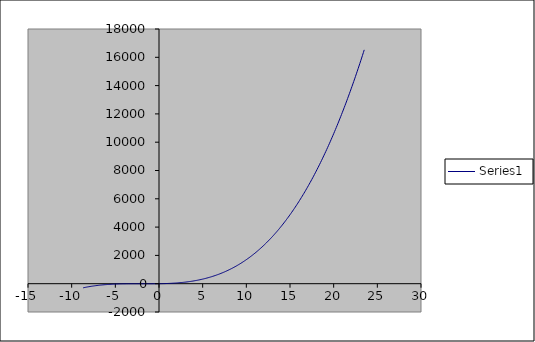
| Category | Series 0 |
|---|---|
| -8.700000000000005 | -292.363 |
| -8.600000000000005 | -279.296 |
| -8.500000000000005 | -266.625 |
| -8.400000000000006 | -254.344 |
| -8.300000000000006 | -242.447 |
| -8.200000000000006 | -230.928 |
| -8.100000000000007 | -219.781 |
| -8.000000000000007 | -209 |
| -7.9000000000000075 | -198.579 |
| -7.800000000000008 | -188.512 |
| -7.700000000000008 | -178.793 |
| -7.6000000000000085 | -169.416 |
| -7.500000000000009 | -160.375 |
| -7.400000000000009 | -151.664 |
| -7.30000000000001 | -143.277 |
| -7.20000000000001 | -135.208 |
| -7.10000000000001 | -127.451 |
| -7.000000000000011 | -120 |
| -6.900000000000011 | -112.849 |
| -6.800000000000011 | -105.992 |
| -6.700000000000012 | -99.423 |
| -6.600000000000012 | -93.136 |
| -6.500000000000012 | -87.125 |
| -6.400000000000013 | -81.384 |
| -6.300000000000013 | -75.907 |
| -6.2000000000000135 | -70.688 |
| -6.100000000000014 | -65.721 |
| -6.000000000000014 | -61 |
| -5.900000000000015 | -56.519 |
| -5.800000000000015 | -52.272 |
| -5.700000000000015 | -48.253 |
| -5.600000000000016 | -44.456 |
| -5.500000000000016 | -40.875 |
| -5.400000000000016 | -37.504 |
| -5.300000000000017 | -34.337 |
| -5.200000000000017 | -31.368 |
| -5.100000000000017 | -28.591 |
| -5.000000000000018 | -26 |
| -4.900000000000018 | -23.589 |
| -4.8000000000000185 | -21.352 |
| -4.700000000000019 | -19.283 |
| -4.600000000000019 | -17.376 |
| -4.5000000000000195 | -15.625 |
| -4.40000000000002 | -14.024 |
| -4.30000000000002 | -12.567 |
| -4.200000000000021 | -11.248 |
| -4.100000000000021 | -10.061 |
| -4.000000000000021 | -9 |
| -3.9000000000000212 | -8.059 |
| -3.800000000000021 | -7.232 |
| -3.700000000000021 | -6.513 |
| -3.600000000000021 | -5.896 |
| -3.500000000000021 | -5.375 |
| -3.400000000000021 | -4.944 |
| -3.3000000000000207 | -4.597 |
| -3.2000000000000206 | -4.328 |
| -3.1000000000000205 | -4.131 |
| -3.0000000000000204 | -4 |
| -2.9000000000000203 | -3.929 |
| -2.8000000000000203 | -3.912 |
| -2.70000000000002 | -3.943 |
| -2.60000000000002 | -4.016 |
| -2.50000000000002 | -4.125 |
| -2.40000000000002 | -4.264 |
| -2.30000000000002 | -4.427 |
| -2.2000000000000197 | -4.608 |
| -2.1000000000000196 | -4.801 |
| -2.0000000000000195 | -5 |
| -1.9000000000000195 | -5.199 |
| -1.8000000000000194 | -5.392 |
| -1.7000000000000193 | -5.573 |
| -1.6000000000000192 | -5.736 |
| -1.500000000000019 | -5.875 |
| -1.400000000000019 | -5.984 |
| -1.300000000000019 | -6.057 |
| -1.2000000000000188 | -6.088 |
| -1.1000000000000187 | -6.071 |
| -1.0000000000000187 | -6 |
| -0.9000000000000187 | -5.869 |
| -0.8000000000000187 | -5.672 |
| -0.7000000000000187 | -5.403 |
| -0.6000000000000187 | -5.056 |
| -0.5000000000000188 | -4.625 |
| -0.4000000000000188 | -4.104 |
| -0.3000000000000188 | -3.487 |
| -0.2000000000000188 | -2.768 |
| -0.1000000000000188 | -1.941 |
| -1.8790524691780774e-14 | -1 |
| 0.09999999999998122 | 0.061 |
| 0.19999999999998122 | 1.248 |
| 0.2999999999999812 | 2.567 |
| 0.39999999999998126 | 4.024 |
| 0.49999999999998124 | 5.625 |
| 0.5999999999999812 | 7.376 |
| 0.6999999999999812 | 9.283 |
| 0.7999999999999812 | 11.352 |
| 0.8999999999999811 | 13.589 |
| 0.9999999999999811 | 16 |
| 1.0999999999999812 | 18.591 |
| 1.1999999999999813 | 21.368 |
| 1.2999999999999814 | 24.337 |
| 1.3999999999999815 | 27.504 |
| 1.4999999999999816 | 30.875 |
| 1.5999999999999817 | 34.456 |
| 1.6999999999999817 | 38.253 |
| 1.7999999999999818 | 42.272 |
| 1.899999999999982 | 46.519 |
| 1.999999999999982 | 51 |
| 2.099999999999982 | 55.721 |
| 2.199999999999982 | 60.688 |
| 2.299999999999982 | 65.907 |
| 2.399999999999982 | 71.384 |
| 2.4999999999999822 | 77.125 |
| 2.5999999999999823 | 83.136 |
| 2.6999999999999824 | 89.423 |
| 2.7999999999999825 | 95.992 |
| 2.8999999999999826 | 102.849 |
| 2.9999999999999827 | 110 |
| 3.0999999999999828 | 117.451 |
| 3.199999999999983 | 125.208 |
| 3.299999999999983 | 133.277 |
| 3.399999999999983 | 141.664 |
| 3.499999999999983 | 150.375 |
| 3.599999999999983 | 159.416 |
| 3.6999999999999833 | 168.793 |
| 3.7999999999999834 | 178.512 |
| 3.8999999999999835 | 188.579 |
| 3.9999999999999836 | 199 |
| 4.099999999999984 | 209.781 |
| 4.199999999999983 | 220.928 |
| 4.299999999999983 | 232.447 |
| 4.399999999999983 | 244.344 |
| 4.499999999999982 | 256.625 |
| 4.599999999999982 | 269.296 |
| 4.6999999999999815 | 282.363 |
| 4.799999999999981 | 295.832 |
| 4.899999999999981 | 309.709 |
| 4.9999999999999805 | 324 |
| 5.09999999999998 | 338.711 |
| 5.19999999999998 | 353.848 |
| 5.299999999999979 | 369.417 |
| 5.399999999999979 | 385.424 |
| 5.499999999999979 | 401.875 |
| 5.599999999999978 | 418.776 |
| 5.699999999999978 | 436.133 |
| 5.799999999999978 | 453.952 |
| 5.899999999999977 | 472.239 |
| 5.999999999999977 | 491 |
| 6.0999999999999766 | 510.241 |
| 6.199999999999976 | 529.968 |
| 6.299999999999976 | 550.187 |
| 6.3999999999999755 | 570.904 |
| 6.499999999999975 | 592.125 |
| 6.599999999999975 | 613.856 |
| 6.699999999999974 | 636.103 |
| 6.799999999999974 | 658.872 |
| 6.899999999999974 | 682.169 |
| 6.999999999999973 | 706 |
| 7.099999999999973 | 730.371 |
| 7.199999999999973 | 755.288 |
| 7.299999999999972 | 780.757 |
| 7.399999999999972 | 806.784 |
| 7.499999999999972 | 833.375 |
| 7.599999999999971 | 860.536 |
| 7.699999999999971 | 888.273 |
| 7.7999999999999705 | 916.592 |
| 7.89999999999997 | 945.499 |
| 7.99999999999997 | 975 |
| 8.09999999999997 | 1005.101 |
| 8.199999999999969 | 1035.808 |
| 8.299999999999969 | 1067.127 |
| 8.399999999999968 | 1099.064 |
| 8.499999999999968 | 1131.625 |
| 8.599999999999968 | 1164.816 |
| 8.699999999999967 | 1198.643 |
| 8.799999999999967 | 1233.112 |
| 8.899999999999967 | 1268.229 |
| 8.999999999999966 | 1304 |
| 9.099999999999966 | 1340.431 |
| 9.199999999999966 | 1377.528 |
| 9.299999999999965 | 1415.297 |
| 9.399999999999965 | 1453.744 |
| 9.499999999999964 | 1492.875 |
| 9.599999999999964 | 1532.696 |
| 9.699999999999964 | 1573.213 |
| 9.799999999999963 | 1614.432 |
| 9.899999999999963 | 1656.359 |
| 9.999999999999963 | 1699 |
| 10.099999999999962 | 1742.361 |
| 10.199999999999962 | 1786.448 |
| 10.299999999999962 | 1831.267 |
| 10.399999999999961 | 1876.824 |
| 10.499999999999961 | 1923.125 |
| 10.59999999999996 | 1970.176 |
| 10.69999999999996 | 2017.983 |
| 10.79999999999996 | 2066.552 |
| 10.89999999999996 | 2115.889 |
| 10.99999999999996 | 2166 |
| 11.099999999999959 | 2216.891 |
| 11.199999999999958 | 2268.568 |
| 11.299999999999958 | 2321.037 |
| 11.399999999999958 | 2374.304 |
| 11.499999999999957 | 2428.375 |
| 11.599999999999957 | 2483.256 |
| 11.699999999999957 | 2538.953 |
| 11.799999999999956 | 2595.472 |
| 11.899999999999956 | 2652.819 |
| 11.999999999999956 | 2711 |
| 12.099999999999955 | 2770.021 |
| 12.199999999999955 | 2829.888 |
| 12.299999999999955 | 2890.607 |
| 12.399999999999954 | 2952.184 |
| 12.499999999999954 | 3014.625 |
| 12.599999999999953 | 3077.936 |
| 12.699999999999953 | 3142.123 |
| 12.799999999999953 | 3207.192 |
| 12.899999999999952 | 3273.149 |
| 12.999999999999952 | 3340 |
| 13.099999999999952 | 3407.751 |
| 13.199999999999951 | 3476.408 |
| 13.299999999999951 | 3545.977 |
| 13.39999999999995 | 3616.464 |
| 13.49999999999995 | 3687.875 |
| 13.59999999999995 | 3760.216 |
| 13.69999999999995 | 3833.493 |
| 13.79999999999995 | 3907.712 |
| 13.899999999999949 | 3982.879 |
| 13.999999999999948 | 4059 |
| 14.099999999999948 | 4136.081 |
| 14.199999999999948 | 4214.128 |
| 14.299999999999947 | 4293.147 |
| 14.399999999999947 | 4373.144 |
| 14.499999999999947 | 4454.125 |
| 14.599999999999946 | 4536.096 |
| 14.699999999999946 | 4619.063 |
| 14.799999999999946 | 4703.032 |
| 14.899999999999945 | 4788.009 |
| 14.999999999999945 | 4874 |
| 15.099999999999945 | 4961.011 |
| 15.199999999999944 | 5049.048 |
| 15.299999999999944 | 5138.117 |
| 15.399999999999944 | 5228.224 |
| 15.499999999999943 | 5319.375 |
| 15.599999999999943 | 5411.576 |
| 15.699999999999942 | 5504.833 |
| 15.799999999999942 | 5599.152 |
| 15.899999999999942 | 5694.539 |
| 15.999999999999941 | 5791 |
| 16.09999999999994 | 5888.541 |
| 16.199999999999942 | 5987.168 |
| 16.299999999999944 | 6086.887 |
| 16.399999999999945 | 6187.704 |
| 16.499999999999947 | 6289.625 |
| 16.599999999999948 | 6392.656 |
| 16.69999999999995 | 6496.803 |
| 16.79999999999995 | 6602.072 |
| 16.899999999999952 | 6708.469 |
| 16.999999999999954 | 6816 |
| 17.099999999999955 | 6924.671 |
| 17.199999999999957 | 7034.488 |
| 17.299999999999958 | 7145.457 |
| 17.39999999999996 | 7257.584 |
| 17.49999999999996 | 7370.875 |
| 17.599999999999962 | 7485.336 |
| 17.699999999999964 | 7600.973 |
| 17.799999999999965 | 7717.792 |
| 17.899999999999967 | 7835.799 |
| 17.999999999999968 | 7955 |
| 18.09999999999997 | 8075.401 |
| 18.19999999999997 | 8197.008 |
| 18.299999999999972 | 8319.827 |
| 18.399999999999974 | 8443.864 |
| 18.499999999999975 | 8569.125 |
| 18.599999999999977 | 8695.616 |
| 18.699999999999978 | 8823.343 |
| 18.79999999999998 | 8952.312 |
| 18.89999999999998 | 9082.529 |
| 18.999999999999982 | 9214 |
| 19.099999999999984 | 9346.731 |
| 19.199999999999985 | 9480.728 |
| 19.299999999999986 | 9615.997 |
| 19.399999999999988 | 9752.544 |
| 19.49999999999999 | 9890.375 |
| 19.59999999999999 | 10029.496 |
| 19.699999999999992 | 10169.913 |
| 19.799999999999994 | 10311.632 |
| 19.899999999999995 | 10454.659 |
| 19.999999999999996 | 10599 |
| 20.099999999999998 | 10744.661 |
| 20.2 | 10891.648 |
| 20.3 | 11039.967 |
| 20.400000000000002 | 11189.624 |
| 20.500000000000004 | 11340.625 |
| 20.600000000000005 | 11492.976 |
| 20.700000000000006 | 11646.683 |
| 20.800000000000008 | 11801.752 |
| 20.90000000000001 | 11958.189 |
| 21.00000000000001 | 12116 |
| 21.100000000000012 | 12275.191 |
| 21.200000000000014 | 12435.768 |
| 21.300000000000015 | 12597.737 |
| 21.400000000000016 | 12761.104 |
| 21.500000000000018 | 12925.875 |
| 21.60000000000002 | 13092.056 |
| 21.70000000000002 | 13259.653 |
| 21.800000000000022 | 13428.672 |
| 21.900000000000023 | 13599.119 |
| 22.000000000000025 | 13771 |
| 22.100000000000026 | 13944.321 |
| 22.200000000000028 | 14119.088 |
| 22.30000000000003 | 14295.307 |
| 22.40000000000003 | 14472.984 |
| 22.500000000000032 | 14652.125 |
| 22.600000000000033 | 14832.736 |
| 22.700000000000035 | 15014.823 |
| 22.800000000000036 | 15198.392 |
| 22.900000000000038 | 15383.449 |
| 23.00000000000004 | 15570 |
| 23.10000000000004 | 15758.051 |
| 23.200000000000042 | 15947.608 |
| 23.300000000000043 | 16138.677 |
| 23.400000000000045 | 16331.264 |
| 23.500000000000046 | 16525.375 |